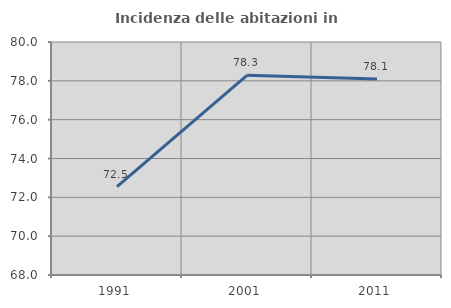
| Category | Incidenza delle abitazioni in proprietà  |
|---|---|
| 1991.0 | 72.546 |
| 2001.0 | 78.286 |
| 2011.0 | 78.092 |